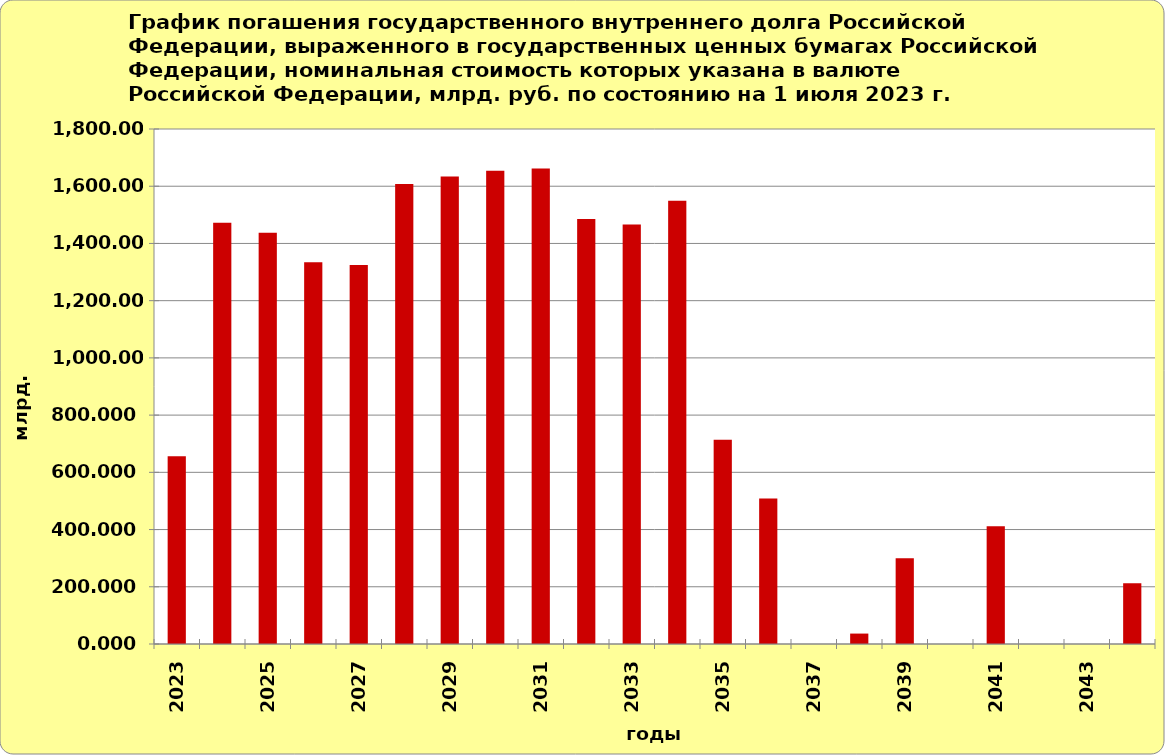
| Category | Series 1 |
|---|---|
| 2023.0 | 656.072 |
| 2024.0 | 1472.226 |
| 2025.0 | 1437.71 |
| 2026.0 | 1334.561 |
| 2027.0 | 1324.833 |
| 2028.0 | 1607.858 |
| 2029.0 | 1633.774 |
| 2030.0 | 1653.65 |
| 2031.0 | 1661.564 |
| 2032.0 | 1485.281 |
| 2033.0 | 1466.377 |
| 2034.0 | 1548.84 |
| 2035.0 | 713.828 |
| 2036.0 | 508.553 |
| 2037.0 | 0 |
| 2038.0 | 36.434 |
| 2039.0 | 300 |
| 2040.0 | 0 |
| 2041.0 | 411.843 |
| 2042.0 | 0 |
| 2043.0 | 0 |
| 2044.0 | 212.636 |